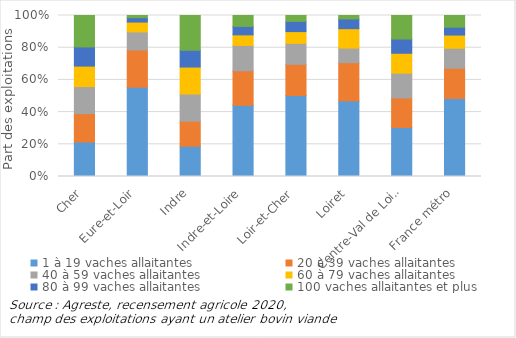
| Category | 1 à 19 vaches allaitantes | 20 à 39 vaches allaitantes | 40 à 59 vaches allaitantes | 60 à 79 vaches allaitantes | 80 à 99 vaches allaitantes | 100 vaches allaitantes et plus |
|---|---|---|---|---|---|---|
| Cher | 202 | 166 | 158 | 120 | 112 | 184 |
| Eure-et-Loir | 163 | 68 | 33 | 18 | 8 | 4 |
| Indre | 242 | 200 | 217 | 216 | 134 | 278 |
| Indre-et-Loire | 202 | 98 | 72 | 30 | 24 | 31 |
| Loir-et-Cher | 151 | 58 | 39 | 22 | 19 | 11 |
| Loiret | 109 | 55 | 21 | 28 | 14 | 5 |
| Centre-Val de Loire | 1069 | 645 | 540 | 434 | 311 | 513 |
| France métro | 54077 | 20933 | 13838 | 9129 | 5465 | 8081 |